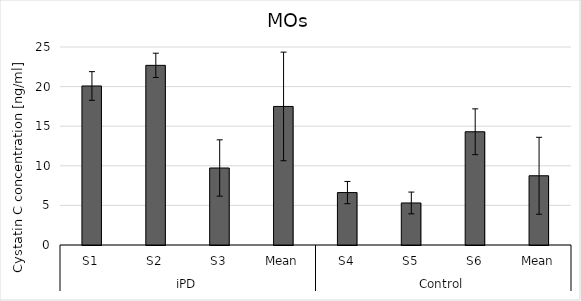
| Category | Series 0 |
|---|---|
| 0 | 20.079 |
| 1 | 22.683 |
| 2 | 9.722 |
| 3 | 17.495 |
| 4 | 6.62 |
| 5 | 5.308 |
| 6 | 14.298 |
| 7 | 8.742 |